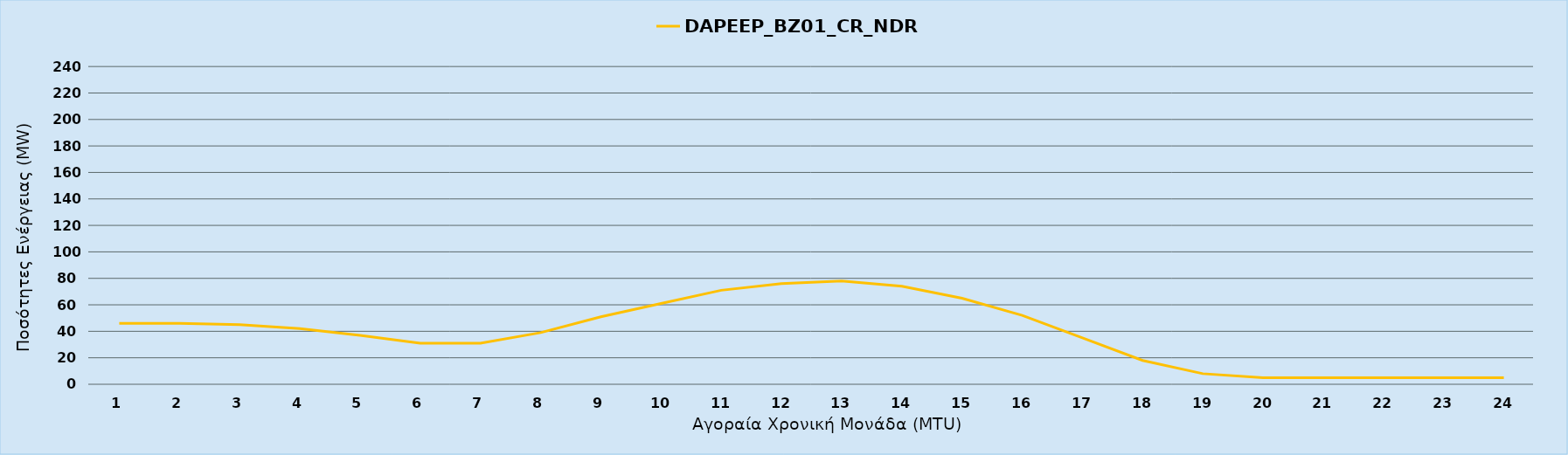
| Category | DAPEEP_BZ01_CR_NDR |
|---|---|
| 0 | 46 |
| 1 | 46 |
| 2 | 45 |
| 3 | 42 |
| 4 | 37 |
| 5 | 31 |
| 6 | 31 |
| 7 | 39 |
| 8 | 51 |
| 9 | 61 |
| 10 | 71 |
| 11 | 76 |
| 12 | 78 |
| 13 | 74 |
| 14 | 65 |
| 15 | 52 |
| 16 | 35 |
| 17 | 18 |
| 18 | 8 |
| 19 | 5 |
| 20 | 5 |
| 21 | 5 |
| 22 | 5 |
| 23 | 5 |